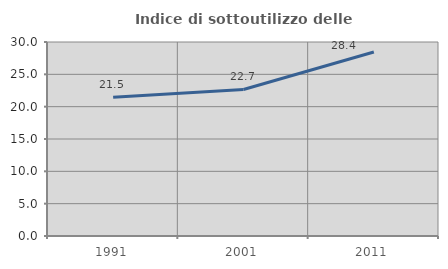
| Category | Indice di sottoutilizzo delle abitazioni  |
|---|---|
| 1991.0 | 21.459 |
| 2001.0 | 22.657 |
| 2011.0 | 28.443 |